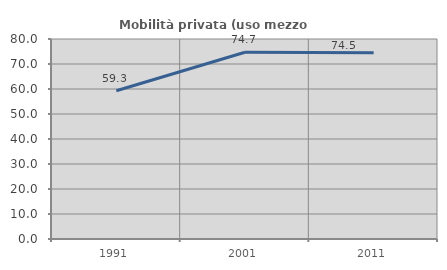
| Category | Mobilità privata (uso mezzo privato) |
|---|---|
| 1991.0 | 59.32 |
| 2001.0 | 74.708 |
| 2011.0 | 74.545 |